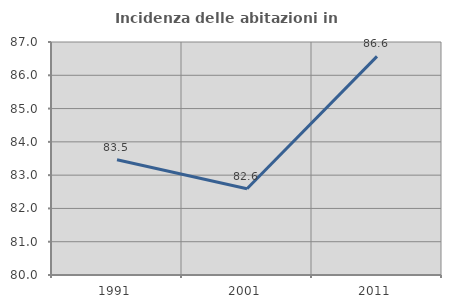
| Category | Incidenza delle abitazioni in proprietà  |
|---|---|
| 1991.0 | 83.463 |
| 2001.0 | 82.59 |
| 2011.0 | 86.567 |